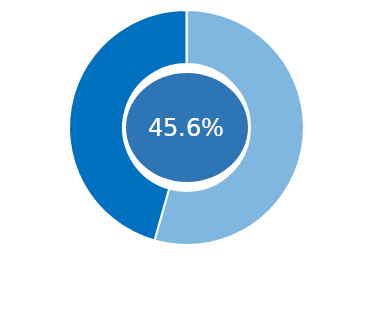
| Category | Series 0 |
|---|---|
| Target 5000.00 | 2720 |
| Funds Raised 2280.00 | 2280 |